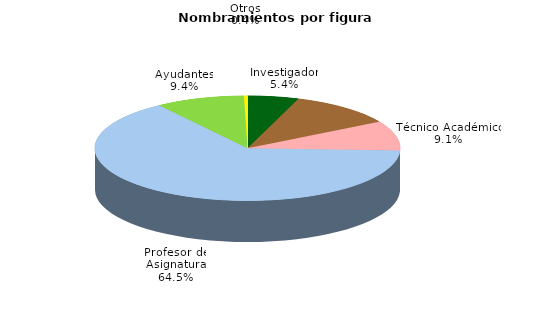
| Category | Series 0 |
|---|---|
| Investigador | 2659 |
| Profesor de Carrera | 5503 |
| Técnico Académico | 4496 |
| Profesor de Asignatura | 31792 |
| Ayudantes | 4642 |
| Otros | 187 |